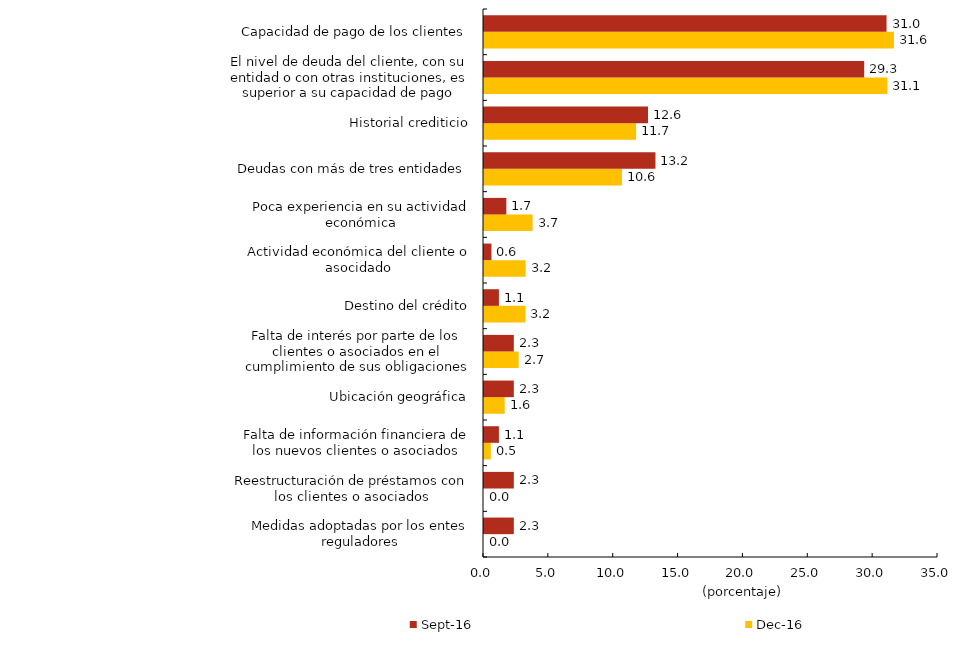
| Category | dic-16 | sep-16 |
|---|---|---|
| Medidas adoptadas por los entes reguladores | 0 | 2.299 |
| Reestructuración de préstamos con los clientes o asociados | 0 | 2.299 |
| Falta de información financiera de los nuevos clientes o asociados | 0.521 | 1.149 |
| Ubicación geográfica | 1.596 | 2.299 |
| Falta de interés por parte de los clientes o asociados en el cumplimiento de sus obligaciones | 2.671 | 2.299 |
| Destino del crédito | 3.192 | 1.149 |
| Actividad económica del cliente o asocidado | 3.209 | 0.575 |
| Poca experiencia en su actividad económica | 3.747 | 1.724 |
| Deudas con más de tres entidades | 10.635 | 13.218 |
| Historial crediticio | 11.727 | 12.644 |
| El nivel de deuda del cliente, con su entidad o con otras instituciones, es superior a su capacidad de pago (sobrendeudamiento) | 31.099 | 29.31 |
| Capacidad de pago de los clientes | 31.603 | 31.034 |